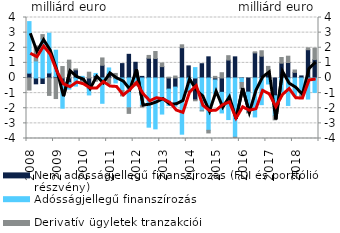
| Category | Nem adósságjellegű finanszírozás (FDI és portfólió részvény) | Adósságjellegű finanszírozás | Derivatív ügyletek tranzakciói |
|---|---|---|---|
| 2008.0 | 0.322 | 3.407 | -0.797 |
| 2008.0 | -0.385 | 1.131 | 0.986 |
| 2008.0 | -0.364 | 2.578 | 0.292 |
| 2008.0 | 0.334 | 2.628 | -1.152 |
| 2009.0 | 0.096 | 1.742 | -1.358 |
| 2009.0 | -0.495 | -1.502 | 0.758 |
| 2009.0 | -0.31 | -0.426 | 1.181 |
| 2009.0 | 0.54 | -0.537 | 0.06 |
| 2010.0 | -0.188 | 0.108 | -0.028 |
| 2010.0 | -0.709 | -0.411 | 0.384 |
| 2010.0 | 0.167 | 0.134 | -0.216 |
| 2010.0 | 0.841 | -1.672 | 0.485 |
| 2011.0 | 0.279 | 0.384 | -0.362 |
| 2011.0 | -0.045 | -0.279 | 0.301 |
| 2011.0 | 0.951 | -0.827 | -0.355 |
| 2011.0 | 1.566 | -1.967 | -0.372 |
| 2012.0 | 1.038 | -0.282 | -0.228 |
| 2012.0 | 0.107 | -1.816 | -0.112 |
| 2012.0 | 1.307 | -3.251 | 0.185 |
| 2012.0 | 1.29 | -3.363 | 0.461 |
| 2013.0 | 0.752 | -2.385 | 0.238 |
| 2013.0 | -0.734 | -1.079 | 0.057 |
| 2013.0 | -0.601 | -1.268 | 0.129 |
| 2013.0 | 2.002 | -3.715 | 0.193 |
| 2014.0 | 0.8 | -0.873 | -0.015 |
| 2014.0 | -1.445 | 0.687 | -0.062 |
| 2014.0 | 0.944 | -2.164 | -0.012 |
| 2014.0 | 1.399 | -3.458 | -0.175 |
| 2015.0 | -0.131 | -0.886 | 0.108 |
| 2015.0 | -0.948 | -1.363 | 0.349 |
| 2015.0 | 1.187 | -2.748 | 0.289 |
| 2015.0 | 1.397 | -3.918 | -0.059 |
| 2016.0 | -0.017 | -0.282 | -0.406 |
| 2016.0 | -0.933 | -1.305 | -0.078 |
| 2016.0 | 1.66 | -2.574 | 0.07 |
| 2016.0 | 1.44 | -1.763 | 0.361 |
| 2017.0 | 0.285 | -0.396 | 0.483 |
| 2017.0 | -1.179 | -1.332 | -0.257 |
| 2017.0 | 0.978 | -0.946 | 0.378 |
| 2017.0 | 1.022 | -1.815 | 0.419 |
| 2018.0 | 0.371 | -1.175 | 0.159 |
| 2018.0 | 0.137 | -1.136 | -0.11 |
| 2018.0 | 1.869 | -1.392 | 0.124 |
| 2018.0 | 1.218 | -0.953 | 0.759 |